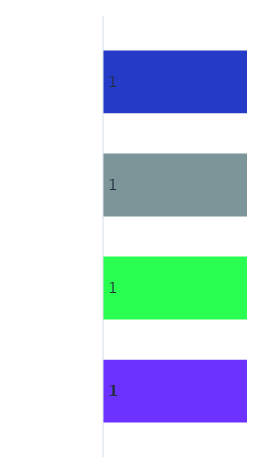
| Category | Series 3 | Series 0 | Series 1 | Series 2 |
|---|---|---|---|---|
| 0 | 1 | 1 | 1 | 1 |